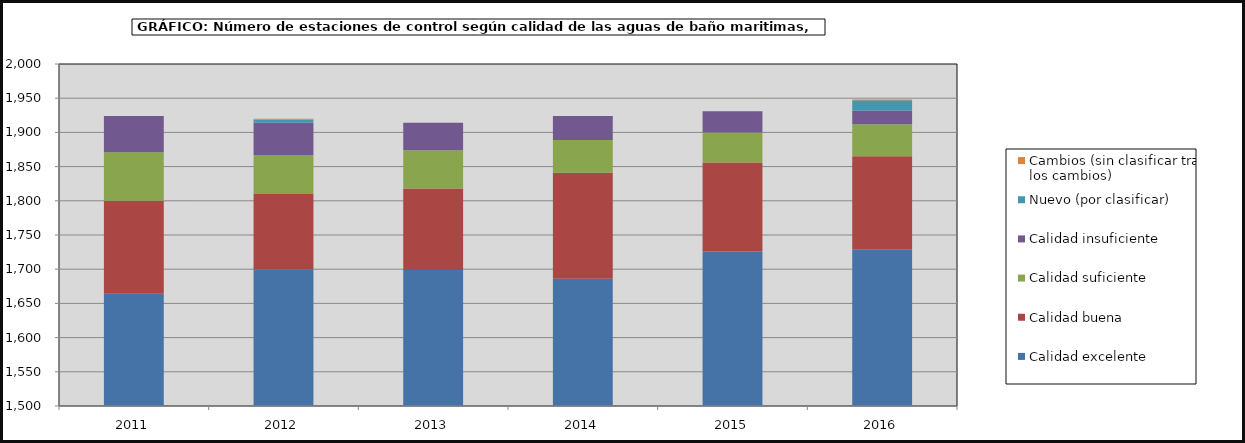
| Category | Calidad excelente | Calidad buena  | Calidad suficiente | Calidad insuficiente | Nuevo (por clasificar) | Cambios (sin clasificar tras los cambios) |
|---|---|---|---|---|---|---|
| 2011.0 | 1664 | 136 | 71 | 53 | 0 | 0 |
| 2012.0 | 1700 | 110 | 57 | 47 | 5 | 1 |
| 2013.0 | 1699 | 119 | 56 | 40 | 0 | 0 |
| 2014.0 | 1686 | 155 | 48 | 35 | 0 | 0 |
| 2015.0 | 1726 | 130 | 44 | 31 | 0 | 0 |
| 2016.0 | 1729 | 136 | 47 | 20 | 15 | 1 |